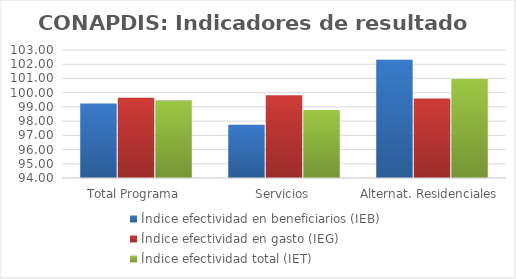
| Category | Índice efectividad en beneficiarios (IEB) | Índice efectividad en gasto (IEG)  | Índice efectividad total (IET) |
|---|---|---|---|
| Total Programa | 99.242 | 99.65 | 99.446 |
| Servicios | 97.749 | 99.822 | 98.785 |
| Alternat. Residenciales | 102.317 | 99.592 | 100.954 |